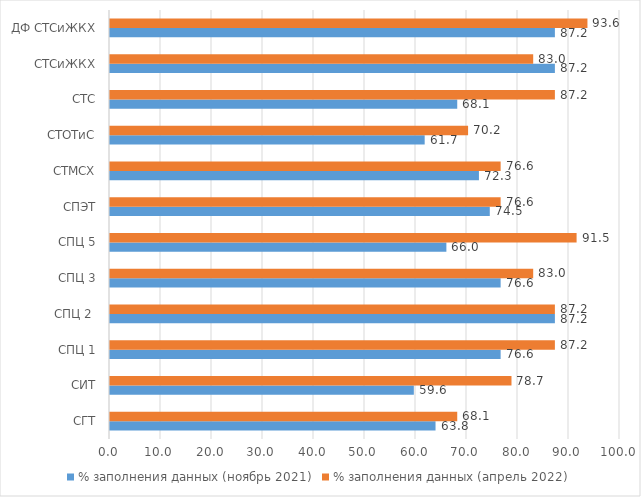
| Category | % заполнения данных (ноябрь 2021) | % заполнения данных (апрель 2022) |
|---|---|---|
| СГТ | 63.83 | 68.085 |
| СИТ | 59.574 | 78.723 |
| СПЦ 1 | 76.596 | 87.234 |
| СПЦ 2  | 87.234 | 87.234 |
|  СПЦ 3 | 76.596 | 82.979 |
|   СПЦ 5 | 65.957 | 91.489 |
|  СПЭТ | 74.468 | 76.596 |
| СТМСХ | 72.34 | 76.596 |
| СТОТиС | 61.702 | 70.213 |
| СТС | 68.085 | 87.234 |
| СТСиЖКХ | 87.234 | 82.979 |
| ДФ СТСиЖКХ | 87.234 | 93.617 |